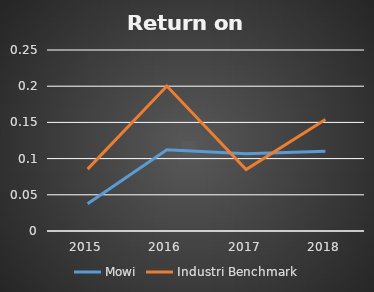
| Category | Mowi | Industri Benchmark |
|---|---|---|
| 2015.0 | 0.038 | 0.085 |
| 2016.0 | 0.112 | 0.2 |
| 2017.0 | 0.107 | 0.085 |
| 2018.0 | 0.11 | 0.154 |